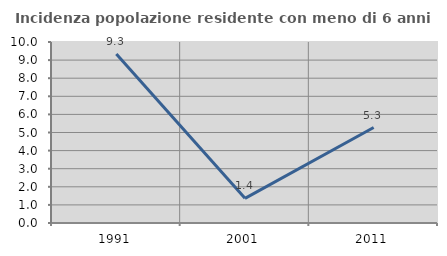
| Category | Incidenza popolazione residente con meno di 6 anni |
|---|---|
| 1991.0 | 9.341 |
| 2001.0 | 1.362 |
| 2011.0 | 5.275 |